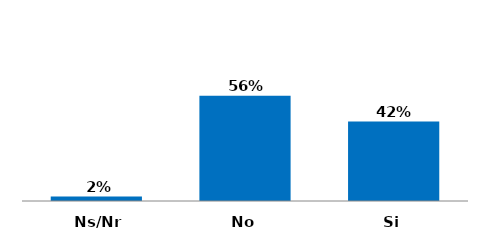
| Category | Series 0 |
|---|---|
| Si | 0.42 |
| No | 0.557 |
| Ns/Nr | 0.023 |